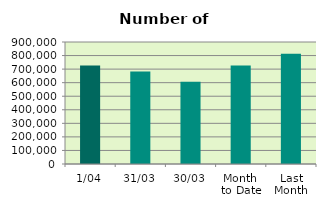
| Category | Series 0 |
|---|---|
| 1/04 | 727062 |
| 31/03 | 682634 |
| 30/03 | 605992 |
| Month 
to Date | 727062 |
| Last
Month | 813408 |